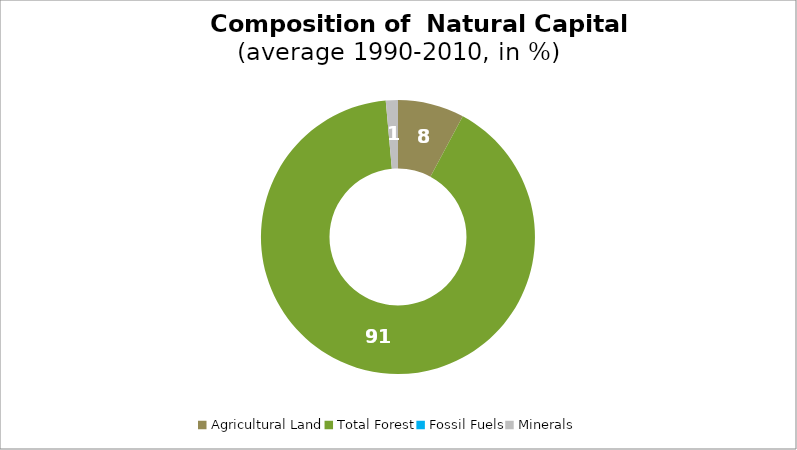
| Category | Series 0 |
|---|---|
| Agricultural Land | 7.839 |
| Total Forest | 90.731 |
| Fossil Fuels | 0 |
| Minerals | 1.43 |